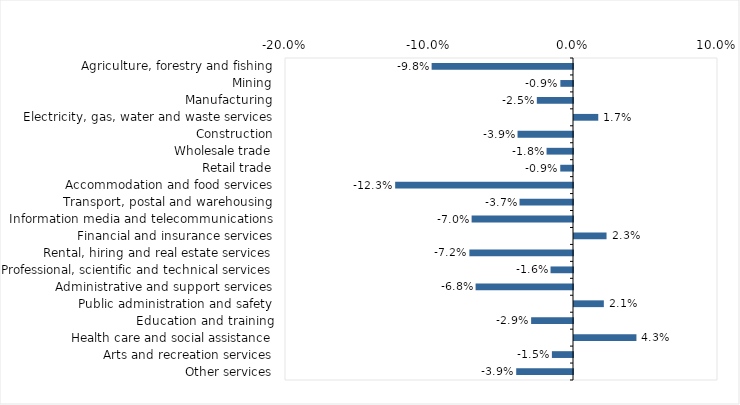
| Category | This week |
|---|---|
| Agriculture, forestry and fishing | -0.098 |
| Mining | -0.009 |
| Manufacturing | -0.025 |
| Electricity, gas, water and waste services | 0.017 |
| Construction | -0.039 |
| Wholesale trade | -0.018 |
| Retail trade | -0.009 |
| Accommodation and food services | -0.123 |
| Transport, postal and warehousing | -0.037 |
| Information media and telecommunications | -0.07 |
| Financial and insurance services | 0.023 |
| Rental, hiring and real estate services | -0.072 |
| Professional, scientific and technical services | -0.016 |
| Administrative and support services | -0.068 |
| Public administration and safety | 0.021 |
| Education and training | -0.029 |
| Health care and social assistance | 0.043 |
| Arts and recreation services | -0.015 |
| Other services | -0.039 |